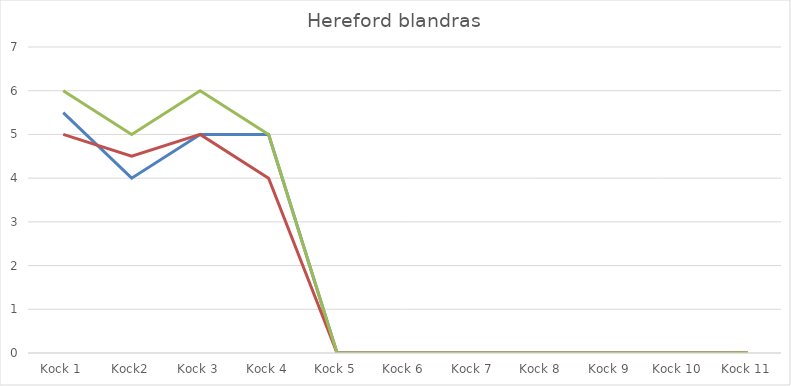
| Category | 26 - 30  = hög råvarukvalitet Utseende | 26 - 30  = hög råvarukvalitet Mörhet | 26 - 30  = hög råvarukvalitet Smak/doft |
|---|---|---|---|
| Kock 1 | 5.5 | 5 | 6 |
| Kock2 | 4 | 4.5 | 5 |
| Kock 3 | 5 | 5 | 6 |
| Kock 4 | 5 | 4 | 5 |
| Kock 5 | 0 | 0 | 0 |
| Kock 6 | 0 | 0 | 0 |
| Kock 7 | 0 | 0 | 0 |
| Kock 8 | 0 | 0 | 0 |
| Kock 9 | 0 | 0 | 0 |
| Kock 10 | 0 | 0 | 0 |
| Kock 11 | 0 | 0 | 0 |